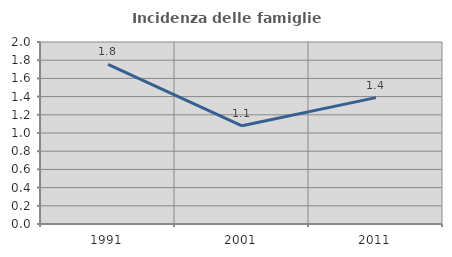
| Category | Incidenza delle famiglie numerose |
|---|---|
| 1991.0 | 1.754 |
| 2001.0 | 1.079 |
| 2011.0 | 1.389 |